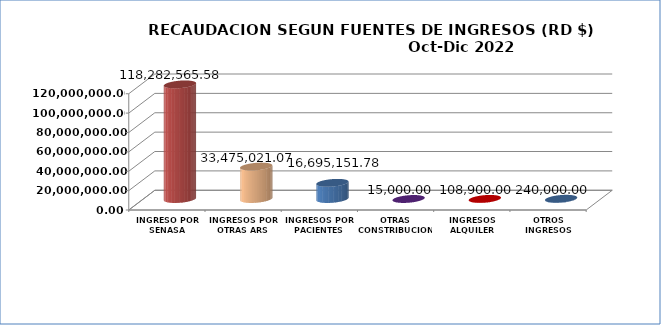
| Category | Series 0 |
|---|---|
| INGRESO POR SENASA | 118282565.58 |
| INGRESOS POR OTRAS ARS | 33475021.07 |
| INGRESOS POR PACIENTES | 16695151.78 |
| OTRAS CONSTRIBUCIONES | 15000 |
| INGRESOS ALQUILER CAFETERIA | 108900 |
| OTROS INGRESOS | 240000 |